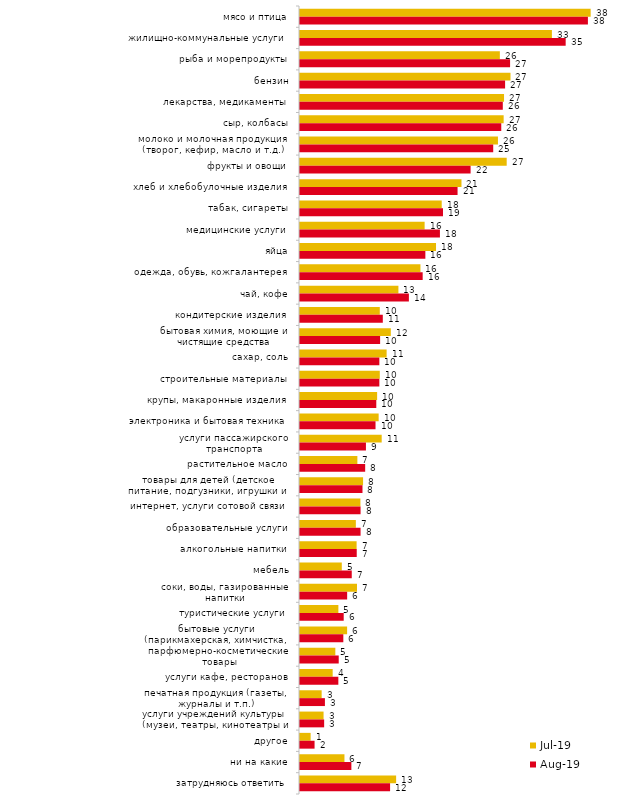
| Category | июл.19 | авг.19 |
|---|---|---|
| мясо и птица | 37.871 | 37.512 |
| жилищно-коммунальные услуги | 32.822 | 34.615 |
| рыба и морепродукты | 26.04 | 27.373 |
| бензин | 27.426 | 26.723 |
| лекарства, медикаменты | 26.584 | 26.424 |
| сыр, колбасы | 26.535 | 26.224 |
| молоко и молочная продукция (творог, кефир, масло и т.д.) | 25.792 | 25.175 |
| фрукты и овощи | 26.931 | 22.228 |
| хлеб и хлебобулочные изделия | 21.04 | 20.529 |
| табак, сигареты | 18.465 | 18.631 |
| медицинские услуги | 16.238 | 18.232 |
| яйца | 17.723 | 16.334 |
| одежда, обувь, кожгалантерея | 15.693 | 15.984 |
| чай, кофе | 12.822 | 14.186 |
| кондитерские изделия | 10.396 | 10.789 |
| бытовая химия, моющие и чистящие средства | 11.832 | 10.44 |
| сахар, соль | 11.287 | 10.34 |
| строительные материалы | 10.396 | 10.34 |
| крупы, макаронные изделия | 10.05 | 9.94 |
| электроника и бытовая техника | 10.248 | 9.84 |
| услуги пассажирского транспорта | 10.644 | 8.591 |
| растительное масло | 7.475 | 8.492 |
| товары для детей (детское питание, подгузники, игрушки и т.п.) | 8.218 | 8.142 |
| интернет, услуги сотовой связи | 7.871 | 7.892 |
| образовательные услуги | 7.277 | 7.892 |
| алкогольные напитки | 7.376 | 7.393 |
| мебель | 5.446 | 6.743 |
| соки, воды, газированные напитки | 7.426 | 6.144 |
| туристические услуги | 5 | 5.694 |
| бытовые услуги (парикмахерская, химчистка, ателье и т.д.) | 6.139 | 5.644 |
| парфюмерно-косметические товары | 4.604 | 5.045 |
| услуги кафе, ресторанов | 4.257 | 4.995 |
| печатная продукция (газеты, журналы и т.п.) | 2.822 | 3.247 |
| услуги учреждений культуры (музеи, театры, кинотеатры и т.п.) | 3.069 | 3.147 |
| другое | 1.386 | 1.898 |
| ни на какие | 5.792 | 6.693 |
| затрудняюсь ответить | 12.525 | 11.738 |